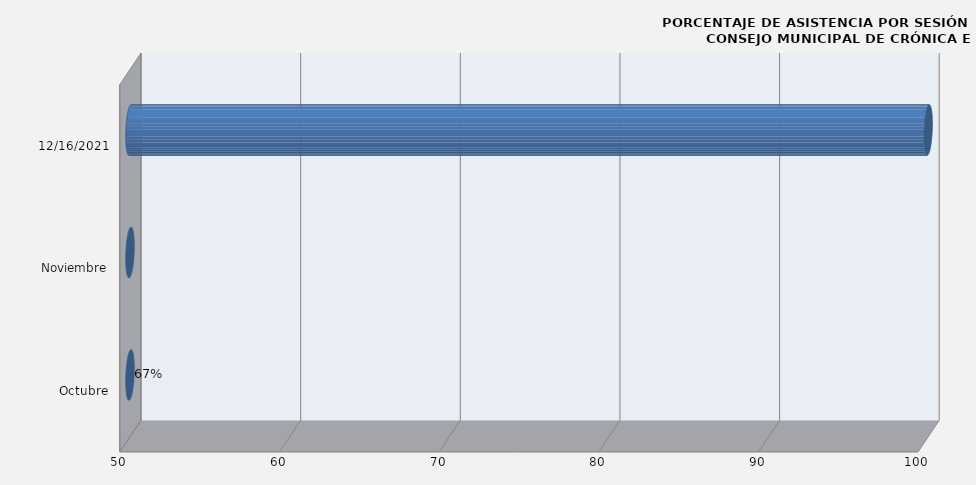
| Category | Series 0 |
|---|---|
| Octubre | 0 |
| Noviembre | 0 |
| 16/12/2021 | 100 |